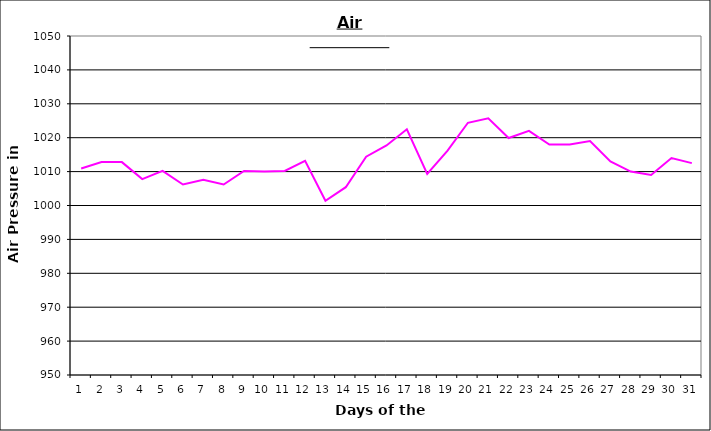
| Category | Series 0 |
|---|---|
| 0 | 1010.9 |
| 1 | 1012.8 |
| 2 | 1012.8 |
| 3 | 1007.8 |
| 4 | 1010.2 |
| 5 | 1006.2 |
| 6 | 1007.6 |
| 7 | 1006.2 |
| 8 | 1010.2 |
| 9 | 1010 |
| 10 | 1010.2 |
| 11 | 1013.2 |
| 12 | 1001.4 |
| 13 | 1005.4 |
| 14 | 1014.4 |
| 15 | 1017.7 |
| 16 | 1022.5 |
| 17 | 1009.3 |
| 18 | 1016.2 |
| 19 | 1024.4 |
| 20 | 1025.7 |
| 21 | 1019.9 |
| 22 | 1022 |
| 23 | 1018 |
| 24 | 1018 |
| 25 | 1019 |
| 26 | 1013 |
| 27 | 1010 |
| 28 | 1009 |
| 29 | 1014 |
| 30 | 1012.5 |